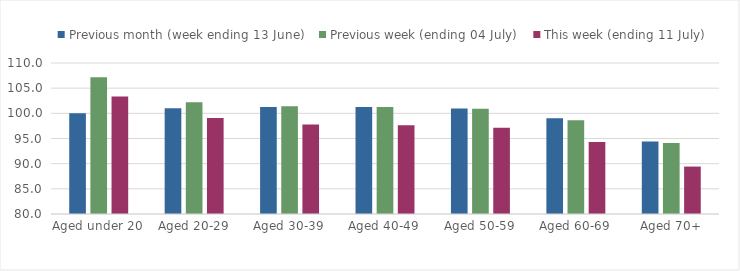
| Category | Previous month (week ending 13 June) | Previous week (ending 04 July) | This week (ending 11 July) |
|---|---|---|---|
| Aged under 20 | 100.005 | 107.18 | 103.359 |
| Aged 20-29 | 100.988 | 102.211 | 99.091 |
| Aged 30-39 | 101.27 | 101.409 | 97.794 |
| Aged 40-49 | 101.258 | 101.254 | 97.634 |
| Aged 50-59 | 100.97 | 100.902 | 97.135 |
| Aged 60-69 | 99.048 | 98.602 | 94.314 |
| Aged 70+ | 94.408 | 94.089 | 89.424 |